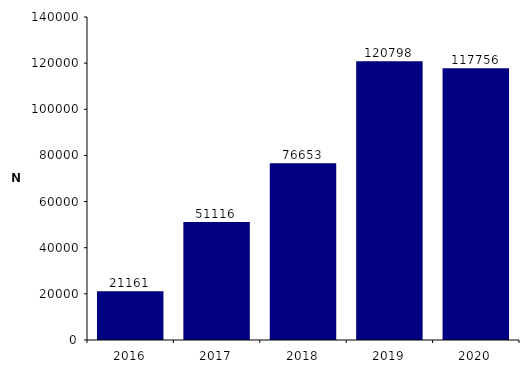
| Category | Nombre de femmes ayant eu un dépistage ADNlcT21 |
|---|---|
| 2016.0 | 21161 |
| 2017.0 | 51116 |
| 2018.0 | 76653 |
| 2019.0 | 120798 |
| 2020.0 | 117756 |